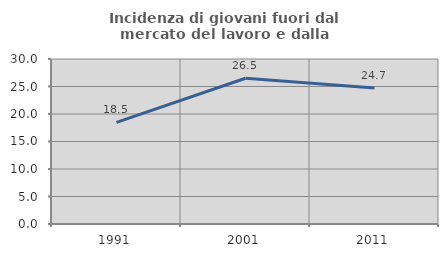
| Category | Incidenza di giovani fuori dal mercato del lavoro e dalla formazione  |
|---|---|
| 1991.0 | 18.475 |
| 2001.0 | 26.501 |
| 2011.0 | 24.708 |